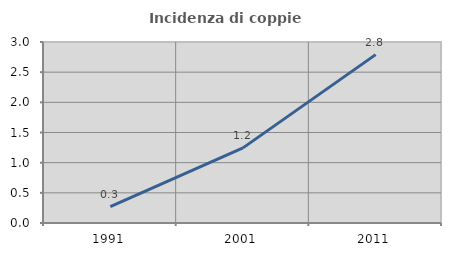
| Category | Incidenza di coppie miste |
|---|---|
| 1991.0 | 0.273 |
| 2001.0 | 1.245 |
| 2011.0 | 2.791 |